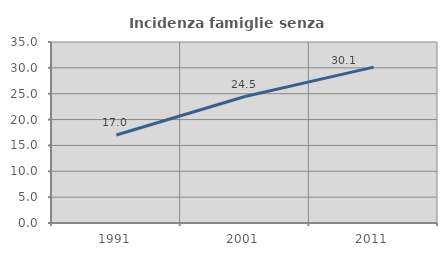
| Category | Incidenza famiglie senza nuclei |
|---|---|
| 1991.0 | 17.027 |
| 2001.0 | 24.459 |
| 2011.0 | 30.147 |